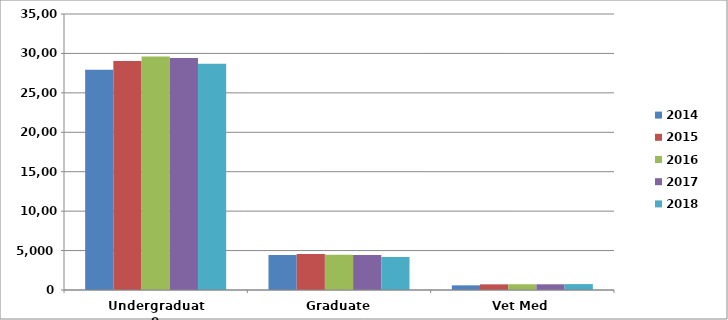
| Category | 2014 | 2015 | 2016 | 2017 | 2018 |
|---|---|---|---|---|---|
| Undergraduate | 27930 | 29053 | 29626 | 29422 | 28706 |
| Graduate | 4429 | 4577 | 4474 | 4428 | 4179 |
| Vet Med | 592 | 717 | 730 | 723 | 749 |